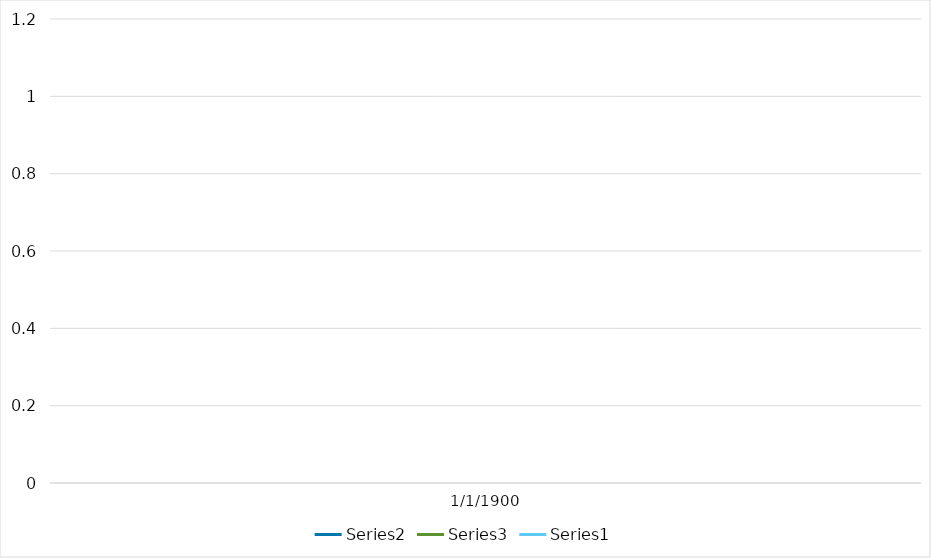
| Category | Series 1 | Series 2 | Series 3 |
|---|---|---|---|
| 0 | 1 | 1 | 1 |